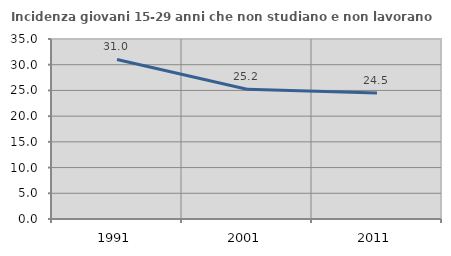
| Category | Incidenza giovani 15-29 anni che non studiano e non lavorano  |
|---|---|
| 1991.0 | 31.022 |
| 2001.0 | 25.215 |
| 2011.0 | 24.522 |